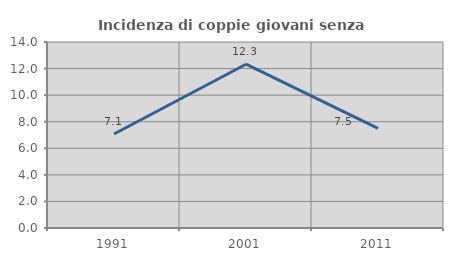
| Category | Incidenza di coppie giovani senza figli |
|---|---|
| 1991.0 | 7.077 |
| 2001.0 | 12.329 |
| 2011.0 | 7.505 |